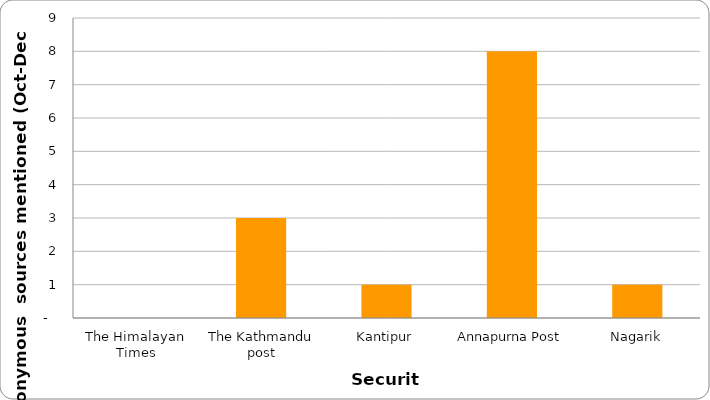
| Category | Security |
|---|---|
| The Himalayan Times | 0 |
| The Kathmandu post | 3 |
| Kantipur | 1 |
| Annapurna Post | 8 |
| Nagarik | 1 |